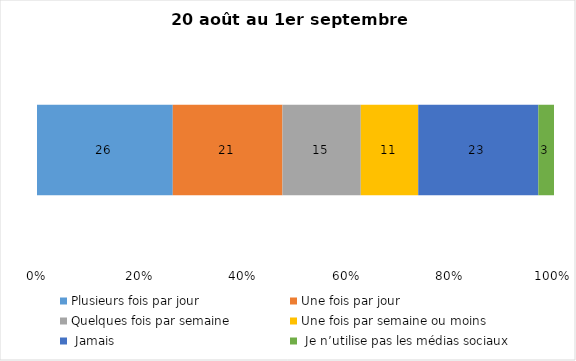
| Category | Plusieurs fois par jour | Une fois par jour | Quelques fois par semaine   | Une fois par semaine ou moins   |  Jamais   |  Je n’utilise pas les médias sociaux |
|---|---|---|---|---|---|---|
| 0 | 26 | 21 | 15 | 11 | 23 | 3 |